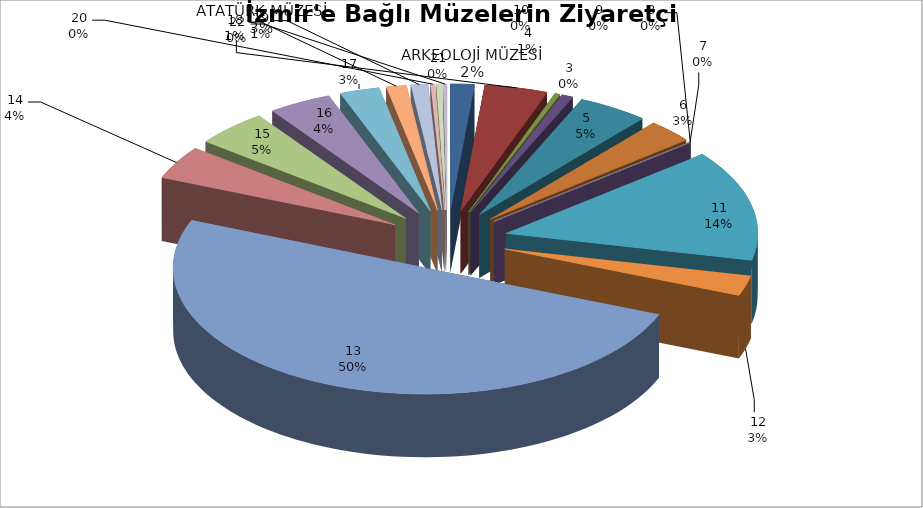
| Category | Series 0 |
|---|---|
| 0 | 38512 |
| 1 | 102120 |
| 2 | 8557 |
| 3 | 18800 |
| 4 | 114818 |
| 5 | 75155 |
| 6 | 939 |
| 7 | 0 |
| 8 | 0 |
| 9 | 0 |
| 10 | 358901 |
| 11 | 65046 |
| 12 | 1265429 |
| 13 | 107842 |
| 14 | 119022 |
| 15 | 102487 |
| 16 | 64447 |
| 17 | 32693 |
| 18 | 27485 |
| 19 | 7129 |
| 20 | 8977 |
| 21 | 6328 |